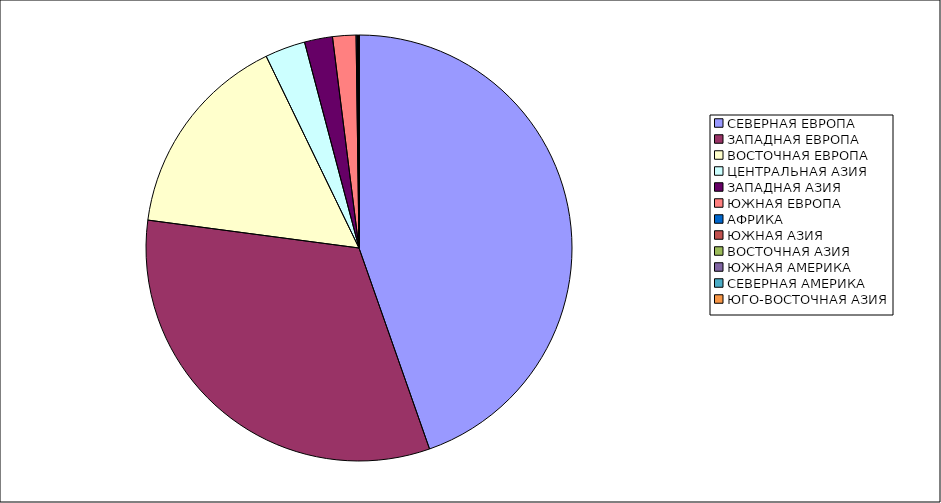
| Category | Оборот |
|---|---|
| СЕВЕРНАЯ ЕВРОПА | 44.627 |
| ЗАПАДНАЯ ЕВРОПА | 32.466 |
| ВОСТОЧНАЯ ЕВРОПА | 15.731 |
| ЦЕНТРАЛЬНАЯ АЗИЯ | 3.059 |
| ЗАПАДНАЯ АЗИЯ | 2.127 |
| ЮЖНАЯ ЕВРОПА | 1.771 |
| АФРИКА | 0.099 |
| ЮЖНАЯ АЗИЯ | 0.043 |
| ВОСТОЧНАЯ АЗИЯ | 0.041 |
| ЮЖНАЯ АМЕРИКА | 0.033 |
| СЕВЕРНАЯ АМЕРИКА | 0.002 |
| ЮГО-ВОСТОЧНАЯ АЗИЯ | 0.001 |